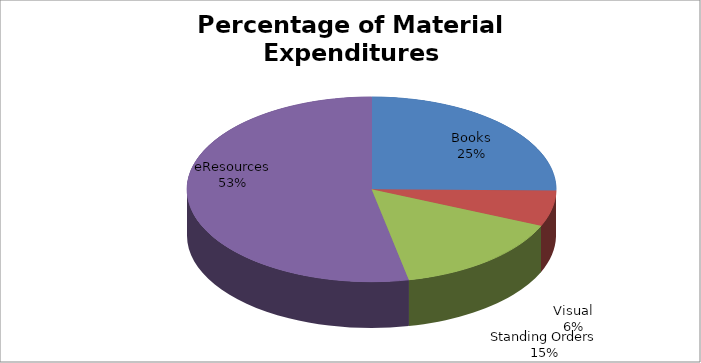
| Category | Series 0 |
|---|---|
| Books | 70416.91 |
| Visual | 17560 |
| Standing Orders | 42743.19 |
| eResources | 148783.11 |